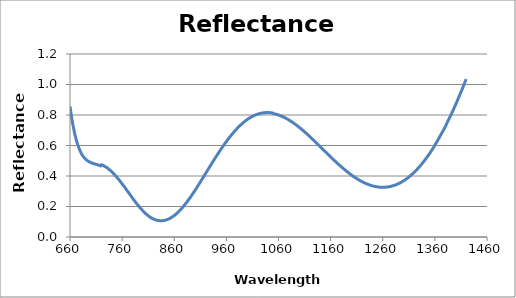
| Category | NIR Window Reflectance |
|---|---|
| 660.0 | 0.857 |
| 661.0 | 0.832 |
| 662.0 | 0.809 |
| 663.0 | 0.787 |
| 664.0 | 0.766 |
| 665.0 | 0.747 |
| 666.0 | 0.728 |
| 667.0 | 0.711 |
| 668.0 | 0.695 |
| 669.0 | 0.679 |
| 670.0 | 0.664 |
| 671.0 | 0.65 |
| 672.0 | 0.638 |
| 673.0 | 0.625 |
| 674.0 | 0.615 |
| 675.0 | 0.604 |
| 676.0 | 0.594 |
| 677.0 | 0.584 |
| 678.0 | 0.576 |
| 679.0 | 0.568 |
| 680.0 | 0.56 |
| 681.0 | 0.553 |
| 682.0 | 0.546 |
| 683.0 | 0.54 |
| 684.0 | 0.536 |
| 685.0 | 0.53 |
| 686.0 | 0.525 |
| 687.0 | 0.522 |
| 688.0 | 0.517 |
| 689.0 | 0.514 |
| 690.0 | 0.51 |
| 691.0 | 0.506 |
| 692.0 | 0.504 |
| 693.0 | 0.501 |
| 694.0 | 0.499 |
| 695.0 | 0.497 |
| 696.0 | 0.495 |
| 697.0 | 0.492 |
| 698.0 | 0.491 |
| 699.0 | 0.49 |
| 700.0 | 0.488 |
| 701.0 | 0.486 |
| 702.0 | 0.485 |
| 703.0 | 0.484 |
| 704.0 | 0.482 |
| 705.0 | 0.482 |
| 706.0 | 0.48 |
| 707.0 | 0.48 |
| 708.0 | 0.478 |
| 709.0 | 0.477 |
| 710.0 | 0.476 |
| 711.0 | 0.476 |
| 712.0 | 0.474 |
| 713.0 | 0.473 |
| 714.0 | 0.472 |
| 715.0 | 0.471 |
| 716.0 | 0.47 |
| 717.0 | 0.47 |
| 718.0 | 0.467 |
| 719.0 | 0.466 |
| 720.0 | 0.473 |
| 721.0 | 0.473 |
| 722.0 | 0.472 |
| 723.0 | 0.471 |
| 724.0 | 0.468 |
| 725.0 | 0.467 |
| 726.0 | 0.465 |
| 727.0 | 0.462 |
| 728.0 | 0.46 |
| 729.0 | 0.458 |
| 730.0 | 0.457 |
| 731.0 | 0.453 |
| 732.0 | 0.452 |
| 733.0 | 0.45 |
| 734.0 | 0.446 |
| 735.0 | 0.443 |
| 736.0 | 0.44 |
| 737.0 | 0.436 |
| 738.0 | 0.435 |
| 739.0 | 0.431 |
| 740.0 | 0.428 |
| 741.0 | 0.424 |
| 742.0 | 0.422 |
| 743.0 | 0.417 |
| 744.0 | 0.414 |
| 745.0 | 0.412 |
| 746.0 | 0.406 |
| 747.0 | 0.402 |
| 748.0 | 0.399 |
| 749.0 | 0.396 |
| 750.0 | 0.391 |
| 751.0 | 0.387 |
| 752.0 | 0.383 |
| 753.0 | 0.379 |
| 754.0 | 0.375 |
| 755.0 | 0.371 |
| 756.0 | 0.367 |
| 757.0 | 0.362 |
| 758.0 | 0.356 |
| 759.0 | 0.353 |
| 760.0 | 0.349 |
| 761.0 | 0.343 |
| 762.0 | 0.339 |
| 763.0 | 0.335 |
| 764.0 | 0.331 |
| 765.0 | 0.326 |
| 766.0 | 0.321 |
| 767.0 | 0.317 |
| 768.0 | 0.311 |
| 769.0 | 0.306 |
| 770.0 | 0.302 |
| 771.0 | 0.297 |
| 772.0 | 0.293 |
| 773.0 | 0.288 |
| 774.0 | 0.283 |
| 775.0 | 0.279 |
| 776.0 | 0.274 |
| 777.0 | 0.269 |
| 778.0 | 0.264 |
| 779.0 | 0.259 |
| 780.0 | 0.255 |
| 781.0 | 0.25 |
| 782.0 | 0.245 |
| 783.0 | 0.241 |
| 784.0 | 0.236 |
| 785.0 | 0.232 |
| 786.0 | 0.227 |
| 787.0 | 0.223 |
| 788.0 | 0.218 |
| 789.0 | 0.214 |
| 790.0 | 0.211 |
| 791.0 | 0.207 |
| 792.0 | 0.202 |
| 793.0 | 0.197 |
| 794.0 | 0.193 |
| 795.0 | 0.19 |
| 796.0 | 0.185 |
| 797.0 | 0.182 |
| 798.0 | 0.178 |
| 799.0 | 0.174 |
| 800.0 | 0.171 |
| 801.0 | 0.167 |
| 802.0 | 0.163 |
| 803.0 | 0.16 |
| 804.0 | 0.156 |
| 805.0 | 0.154 |
| 806.0 | 0.151 |
| 807.0 | 0.149 |
| 808.0 | 0.145 |
| 809.0 | 0.142 |
| 810.0 | 0.14 |
| 811.0 | 0.137 |
| 812.0 | 0.134 |
| 813.0 | 0.132 |
| 814.0 | 0.129 |
| 815.0 | 0.128 |
| 816.0 | 0.125 |
| 817.0 | 0.124 |
| 818.0 | 0.122 |
| 819.0 | 0.119 |
| 820.0 | 0.118 |
| 821.0 | 0.117 |
| 822.0 | 0.115 |
| 823.0 | 0.114 |
| 824.0 | 0.113 |
| 825.0 | 0.111 |
| 826.0 | 0.11 |
| 827.0 | 0.11 |
| 828.0 | 0.11 |
| 829.0 | 0.108 |
| 830.0 | 0.108 |
| 831.0 | 0.107 |
| 832.0 | 0.107 |
| 833.0 | 0.107 |
| 834.0 | 0.106 |
| 835.0 | 0.107 |
| 836.0 | 0.106 |
| 837.0 | 0.107 |
| 838.0 | 0.107 |
| 839.0 | 0.108 |
| 840.0 | 0.108 |
| 841.0 | 0.109 |
| 842.0 | 0.109 |
| 843.0 | 0.111 |
| 844.0 | 0.111 |
| 845.0 | 0.113 |
| 846.0 | 0.113 |
| 847.0 | 0.115 |
| 848.0 | 0.116 |
| 849.0 | 0.117 |
| 850.0 | 0.12 |
| 851.0 | 0.121 |
| 852.0 | 0.123 |
| 853.0 | 0.125 |
| 854.0 | 0.127 |
| 855.0 | 0.129 |
| 856.0 | 0.131 |
| 857.0 | 0.133 |
| 858.0 | 0.136 |
| 859.0 | 0.139 |
| 860.0 | 0.141 |
| 861.0 | 0.143 |
| 862.0 | 0.146 |
| 863.0 | 0.149 |
| 864.0 | 0.153 |
| 865.0 | 0.155 |
| 866.0 | 0.159 |
| 867.0 | 0.162 |
| 868.0 | 0.164 |
| 869.0 | 0.168 |
| 870.0 | 0.172 |
| 871.0 | 0.175 |
| 872.0 | 0.179 |
| 873.0 | 0.183 |
| 874.0 | 0.186 |
| 875.0 | 0.19 |
| 876.0 | 0.194 |
| 877.0 | 0.198 |
| 878.0 | 0.203 |
| 879.0 | 0.206 |
| 880.0 | 0.211 |
| 881.0 | 0.215 |
| 882.0 | 0.219 |
| 883.0 | 0.223 |
| 884.0 | 0.228 |
| 885.0 | 0.233 |
| 886.0 | 0.237 |
| 887.0 | 0.242 |
| 888.0 | 0.247 |
| 889.0 | 0.252 |
| 890.0 | 0.256 |
| 891.0 | 0.261 |
| 892.0 | 0.266 |
| 893.0 | 0.271 |
| 894.0 | 0.276 |
| 895.0 | 0.281 |
| 896.0 | 0.286 |
| 897.0 | 0.291 |
| 898.0 | 0.296 |
| 899.0 | 0.301 |
| 900.0 | 0.307 |
| 901.0 | 0.312 |
| 902.0 | 0.317 |
| 903.0 | 0.323 |
| 904.0 | 0.328 |
| 905.0 | 0.334 |
| 906.0 | 0.339 |
| 907.0 | 0.344 |
| 908.0 | 0.35 |
| 909.0 | 0.355 |
| 910.0 | 0.36 |
| 911.0 | 0.366 |
| 912.0 | 0.371 |
| 913.0 | 0.377 |
| 914.0 | 0.382 |
| 915.0 | 0.388 |
| 916.0 | 0.393 |
| 917.0 | 0.399 |
| 918.0 | 0.405 |
| 919.0 | 0.41 |
| 920.0 | 0.416 |
| 921.0 | 0.421 |
| 922.0 | 0.427 |
| 923.0 | 0.433 |
| 924.0 | 0.438 |
| 925.0 | 0.444 |
| 926.0 | 0.449 |
| 927.0 | 0.455 |
| 928.0 | 0.46 |
| 929.0 | 0.466 |
| 930.0 | 0.471 |
| 931.0 | 0.477 |
| 932.0 | 0.482 |
| 933.0 | 0.488 |
| 934.0 | 0.493 |
| 935.0 | 0.499 |
| 936.0 | 0.504 |
| 937.0 | 0.51 |
| 938.0 | 0.515 |
| 939.0 | 0.52 |
| 940.0 | 0.526 |
| 941.0 | 0.531 |
| 942.0 | 0.536 |
| 943.0 | 0.542 |
| 944.0 | 0.547 |
| 945.0 | 0.552 |
| 946.0 | 0.557 |
| 947.0 | 0.562 |
| 948.0 | 0.567 |
| 949.0 | 0.573 |
| 950.0 | 0.578 |
| 951.0 | 0.583 |
| 952.0 | 0.588 |
| 953.0 | 0.592 |
| 954.0 | 0.597 |
| 955.0 | 0.602 |
| 956.0 | 0.607 |
| 957.0 | 0.612 |
| 958.0 | 0.616 |
| 959.0 | 0.621 |
| 960.0 | 0.626 |
| 961.0 | 0.631 |
| 962.0 | 0.635 |
| 963.0 | 0.64 |
| 964.0 | 0.644 |
| 965.0 | 0.649 |
| 966.0 | 0.653 |
| 967.0 | 0.657 |
| 968.0 | 0.662 |
| 969.0 | 0.666 |
| 970.0 | 0.67 |
| 971.0 | 0.674 |
| 972.0 | 0.678 |
| 973.0 | 0.682 |
| 974.0 | 0.686 |
| 975.0 | 0.69 |
| 976.0 | 0.694 |
| 977.0 | 0.698 |
| 978.0 | 0.702 |
| 979.0 | 0.706 |
| 980.0 | 0.71 |
| 981.0 | 0.713 |
| 982.0 | 0.717 |
| 983.0 | 0.72 |
| 984.0 | 0.723 |
| 985.0 | 0.727 |
| 986.0 | 0.73 |
| 987.0 | 0.734 |
| 988.0 | 0.737 |
| 989.0 | 0.74 |
| 990.0 | 0.743 |
| 991.0 | 0.746 |
| 992.0 | 0.749 |
| 993.0 | 0.752 |
| 994.0 | 0.754 |
| 995.0 | 0.757 |
| 996.0 | 0.76 |
| 997.0 | 0.763 |
| 998.0 | 0.765 |
| 999.0 | 0.768 |
| 1000.0 | 0.77 |
| 1001.0 | 0.773 |
| 1002.0 | 0.775 |
| 1003.0 | 0.777 |
| 1004.0 | 0.779 |
| 1005.0 | 0.781 |
| 1006.0 | 0.783 |
| 1007.0 | 0.785 |
| 1008.0 | 0.787 |
| 1009.0 | 0.789 |
| 1010.0 | 0.791 |
| 1011.0 | 0.793 |
| 1012.0 | 0.794 |
| 1013.0 | 0.796 |
| 1014.0 | 0.798 |
| 1015.0 | 0.799 |
| 1016.0 | 0.801 |
| 1017.0 | 0.802 |
| 1018.0 | 0.803 |
| 1019.0 | 0.804 |
| 1020.0 | 0.805 |
| 1021.0 | 0.807 |
| 1022.0 | 0.807 |
| 1023.0 | 0.808 |
| 1024.0 | 0.81 |
| 1025.0 | 0.81 |
| 1026.0 | 0.811 |
| 1027.0 | 0.812 |
| 1028.0 | 0.813 |
| 1029.0 | 0.813 |
| 1030.0 | 0.814 |
| 1031.0 | 0.814 |
| 1032.0 | 0.815 |
| 1033.0 | 0.815 |
| 1034.0 | 0.815 |
| 1035.0 | 0.816 |
| 1036.0 | 0.816 |
| 1037.0 | 0.816 |
| 1038.0 | 0.816 |
| 1039.0 | 0.816 |
| 1040.0 | 0.816 |
| 1041.0 | 0.816 |
| 1042.0 | 0.816 |
| 1043.0 | 0.815 |
| 1044.0 | 0.815 |
| 1045.0 | 0.815 |
| 1046.0 | 0.814 |
| 1047.0 | 0.814 |
| 1048.0 | 0.814 |
| 1049.0 | 0.813 |
| 1050.0 | 0.809 |
| 1051.0 | 0.808 |
| 1052.0 | 0.808 |
| 1053.0 | 0.807 |
| 1054.0 | 0.806 |
| 1055.0 | 0.805 |
| 1056.0 | 0.804 |
| 1057.0 | 0.804 |
| 1058.0 | 0.803 |
| 1059.0 | 0.801 |
| 1060.0 | 0.8 |
| 1061.0 | 0.799 |
| 1062.0 | 0.798 |
| 1063.0 | 0.796 |
| 1064.0 | 0.795 |
| 1065.0 | 0.793 |
| 1066.0 | 0.792 |
| 1067.0 | 0.791 |
| 1068.0 | 0.789 |
| 1069.0 | 0.788 |
| 1070.0 | 0.786 |
| 1071.0 | 0.784 |
| 1072.0 | 0.782 |
| 1073.0 | 0.781 |
| 1074.0 | 0.779 |
| 1075.0 | 0.777 |
| 1076.0 | 0.775 |
| 1077.0 | 0.774 |
| 1078.0 | 0.771 |
| 1079.0 | 0.769 |
| 1080.0 | 0.767 |
| 1081.0 | 0.765 |
| 1082.0 | 0.763 |
| 1083.0 | 0.761 |
| 1084.0 | 0.758 |
| 1085.0 | 0.756 |
| 1086.0 | 0.754 |
| 1087.0 | 0.752 |
| 1088.0 | 0.749 |
| 1089.0 | 0.747 |
| 1090.0 | 0.744 |
| 1091.0 | 0.742 |
| 1092.0 | 0.739 |
| 1093.0 | 0.737 |
| 1094.0 | 0.734 |
| 1095.0 | 0.732 |
| 1096.0 | 0.729 |
| 1097.0 | 0.727 |
| 1098.0 | 0.724 |
| 1099.0 | 0.721 |
| 1100.0 | 0.719 |
| 1101.0 | 0.715 |
| 1102.0 | 0.713 |
| 1103.0 | 0.71 |
| 1104.0 | 0.707 |
| 1105.0 | 0.704 |
| 1106.0 | 0.701 |
| 1107.0 | 0.698 |
| 1108.0 | 0.696 |
| 1109.0 | 0.693 |
| 1110.0 | 0.689 |
| 1111.0 | 0.686 |
| 1112.0 | 0.683 |
| 1113.0 | 0.681 |
| 1114.0 | 0.677 |
| 1115.0 | 0.674 |
| 1116.0 | 0.671 |
| 1117.0 | 0.668 |
| 1118.0 | 0.665 |
| 1119.0 | 0.662 |
| 1120.0 | 0.658 |
| 1121.0 | 0.655 |
| 1122.0 | 0.653 |
| 1123.0 | 0.649 |
| 1124.0 | 0.646 |
| 1125.0 | 0.643 |
| 1126.0 | 0.638 |
| 1127.0 | 0.636 |
| 1128.0 | 0.632 |
| 1129.0 | 0.629 |
| 1130.0 | 0.626 |
| 1131.0 | 0.622 |
| 1132.0 | 0.619 |
| 1133.0 | 0.617 |
| 1134.0 | 0.613 |
| 1135.0 | 0.609 |
| 1136.0 | 0.606 |
| 1137.0 | 0.602 |
| 1138.0 | 0.599 |
| 1139.0 | 0.596 |
| 1140.0 | 0.592 |
| 1141.0 | 0.589 |
| 1142.0 | 0.586 |
| 1143.0 | 0.582 |
| 1144.0 | 0.579 |
| 1145.0 | 0.575 |
| 1146.0 | 0.572 |
| 1147.0 | 0.569 |
| 1148.0 | 0.565 |
| 1149.0 | 0.562 |
| 1150.0 | 0.559 |
| 1151.0 | 0.556 |
| 1152.0 | 0.552 |
| 1153.0 | 0.549 |
| 1154.0 | 0.545 |
| 1155.0 | 0.542 |
| 1156.0 | 0.538 |
| 1157.0 | 0.535 |
| 1158.0 | 0.532 |
| 1159.0 | 0.529 |
| 1160.0 | 0.525 |
| 1161.0 | 0.522 |
| 1162.0 | 0.519 |
| 1163.0 | 0.515 |
| 1164.0 | 0.512 |
| 1165.0 | 0.509 |
| 1166.0 | 0.505 |
| 1167.0 | 0.502 |
| 1168.0 | 0.499 |
| 1169.0 | 0.496 |
| 1170.0 | 0.493 |
| 1171.0 | 0.489 |
| 1172.0 | 0.486 |
| 1173.0 | 0.483 |
| 1174.0 | 0.48 |
| 1175.0 | 0.477 |
| 1176.0 | 0.474 |
| 1177.0 | 0.471 |
| 1178.0 | 0.468 |
| 1179.0 | 0.465 |
| 1180.0 | 0.462 |
| 1181.0 | 0.459 |
| 1182.0 | 0.456 |
| 1183.0 | 0.453 |
| 1184.0 | 0.45 |
| 1185.0 | 0.447 |
| 1186.0 | 0.444 |
| 1187.0 | 0.441 |
| 1188.0 | 0.439 |
| 1189.0 | 0.435 |
| 1190.0 | 0.433 |
| 1191.0 | 0.43 |
| 1192.0 | 0.427 |
| 1193.0 | 0.425 |
| 1194.0 | 0.422 |
| 1195.0 | 0.419 |
| 1196.0 | 0.417 |
| 1197.0 | 0.414 |
| 1198.0 | 0.412 |
| 1199.0 | 0.409 |
| 1200.0 | 0.407 |
| 1201.0 | 0.404 |
| 1202.0 | 0.402 |
| 1203.0 | 0.399 |
| 1204.0 | 0.397 |
| 1205.0 | 0.394 |
| 1206.0 | 0.392 |
| 1207.0 | 0.39 |
| 1208.0 | 0.388 |
| 1209.0 | 0.386 |
| 1210.0 | 0.383 |
| 1211.0 | 0.381 |
| 1212.0 | 0.379 |
| 1213.0 | 0.377 |
| 1214.0 | 0.375 |
| 1215.0 | 0.373 |
| 1216.0 | 0.371 |
| 1217.0 | 0.369 |
| 1218.0 | 0.367 |
| 1219.0 | 0.365 |
| 1220.0 | 0.364 |
| 1221.0 | 0.362 |
| 1222.0 | 0.36 |
| 1223.0 | 0.358 |
| 1224.0 | 0.356 |
| 1225.0 | 0.355 |
| 1226.0 | 0.353 |
| 1227.0 | 0.352 |
| 1228.0 | 0.35 |
| 1229.0 | 0.349 |
| 1230.0 | 0.348 |
| 1231.0 | 0.346 |
| 1232.0 | 0.345 |
| 1233.0 | 0.343 |
| 1234.0 | 0.342 |
| 1235.0 | 0.341 |
| 1236.0 | 0.34 |
| 1237.0 | 0.339 |
| 1238.0 | 0.338 |
| 1239.0 | 0.337 |
| 1240.0 | 0.336 |
| 1241.0 | 0.335 |
| 1242.0 | 0.334 |
| 1243.0 | 0.333 |
| 1244.0 | 0.332 |
| 1245.0 | 0.331 |
| 1246.0 | 0.331 |
| 1247.0 | 0.33 |
| 1248.0 | 0.329 |
| 1249.0 | 0.329 |
| 1250.0 | 0.329 |
| 1251.0 | 0.328 |
| 1252.0 | 0.327 |
| 1253.0 | 0.327 |
| 1254.0 | 0.327 |
| 1255.0 | 0.326 |
| 1256.0 | 0.326 |
| 1257.0 | 0.326 |
| 1258.0 | 0.326 |
| 1259.0 | 0.326 |
| 1260.0 | 0.326 |
| 1261.0 | 0.326 |
| 1262.0 | 0.326 |
| 1263.0 | 0.326 |
| 1264.0 | 0.327 |
| 1265.0 | 0.327 |
| 1266.0 | 0.327 |
| 1267.0 | 0.327 |
| 1268.0 | 0.328 |
| 1269.0 | 0.328 |
| 1270.0 | 0.328 |
| 1271.0 | 0.329 |
| 1272.0 | 0.33 |
| 1273.0 | 0.33 |
| 1274.0 | 0.331 |
| 1275.0 | 0.332 |
| 1276.0 | 0.333 |
| 1277.0 | 0.333 |
| 1278.0 | 0.335 |
| 1279.0 | 0.336 |
| 1280.0 | 0.336 |
| 1281.0 | 0.337 |
| 1282.0 | 0.338 |
| 1283.0 | 0.34 |
| 1284.0 | 0.341 |
| 1285.0 | 0.342 |
| 1286.0 | 0.344 |
| 1287.0 | 0.345 |
| 1288.0 | 0.347 |
| 1289.0 | 0.348 |
| 1290.0 | 0.35 |
| 1291.0 | 0.351 |
| 1292.0 | 0.353 |
| 1293.0 | 0.354 |
| 1294.0 | 0.356 |
| 1295.0 | 0.358 |
| 1296.0 | 0.36 |
| 1297.0 | 0.362 |
| 1298.0 | 0.364 |
| 1299.0 | 0.366 |
| 1300.0 | 0.369 |
| 1301.0 | 0.371 |
| 1302.0 | 0.373 |
| 1303.0 | 0.375 |
| 1304.0 | 0.377 |
| 1305.0 | 0.38 |
| 1306.0 | 0.383 |
| 1307.0 | 0.385 |
| 1308.0 | 0.387 |
| 1309.0 | 0.39 |
| 1310.0 | 0.393 |
| 1311.0 | 0.395 |
| 1312.0 | 0.399 |
| 1313.0 | 0.402 |
| 1314.0 | 0.405 |
| 1315.0 | 0.407 |
| 1316.0 | 0.41 |
| 1317.0 | 0.413 |
| 1318.0 | 0.416 |
| 1319.0 | 0.419 |
| 1320.0 | 0.423 |
| 1321.0 | 0.427 |
| 1322.0 | 0.43 |
| 1323.0 | 0.433 |
| 1324.0 | 0.437 |
| 1325.0 | 0.441 |
| 1326.0 | 0.444 |
| 1327.0 | 0.448 |
| 1328.0 | 0.451 |
| 1329.0 | 0.456 |
| 1330.0 | 0.459 |
| 1331.0 | 0.463 |
| 1332.0 | 0.467 |
| 1333.0 | 0.471 |
| 1334.0 | 0.475 |
| 1335.0 | 0.479 |
| 1336.0 | 0.484 |
| 1337.0 | 0.488 |
| 1338.0 | 0.492 |
| 1339.0 | 0.497 |
| 1340.0 | 0.501 |
| 1341.0 | 0.506 |
| 1342.0 | 0.51 |
| 1343.0 | 0.515 |
| 1344.0 | 0.519 |
| 1345.0 | 0.524 |
| 1346.0 | 0.529 |
| 1347.0 | 0.534 |
| 1348.0 | 0.538 |
| 1349.0 | 0.543 |
| 1350.0 | 0.548 |
| 1351.0 | 0.553 |
| 1352.0 | 0.558 |
| 1353.0 | 0.564 |
| 1354.0 | 0.568 |
| 1355.0 | 0.574 |
| 1356.0 | 0.58 |
| 1357.0 | 0.584 |
| 1358.0 | 0.59 |
| 1359.0 | 0.596 |
| 1360.0 | 0.602 |
| 1361.0 | 0.608 |
| 1362.0 | 0.613 |
| 1363.0 | 0.62 |
| 1364.0 | 0.625 |
| 1365.0 | 0.631 |
| 1366.0 | 0.638 |
| 1367.0 | 0.643 |
| 1368.0 | 0.65 |
| 1369.0 | 0.656 |
| 1370.0 | 0.662 |
| 1371.0 | 0.668 |
| 1372.0 | 0.675 |
| 1373.0 | 0.681 |
| 1374.0 | 0.687 |
| 1375.0 | 0.692 |
| 1376.0 | 0.698 |
| 1377.0 | 0.704 |
| 1378.0 | 0.71 |
| 1379.0 | 0.717 |
| 1380.0 | 0.723 |
| 1381.0 | 0.731 |
| 1382.0 | 0.738 |
| 1383.0 | 0.746 |
| 1384.0 | 0.753 |
| 1385.0 | 0.761 |
| 1386.0 | 0.767 |
| 1387.0 | 0.773 |
| 1388.0 | 0.781 |
| 1389.0 | 0.787 |
| 1390.0 | 0.794 |
| 1391.0 | 0.801 |
| 1392.0 | 0.809 |
| 1393.0 | 0.816 |
| 1394.0 | 0.823 |
| 1395.0 | 0.831 |
| 1396.0 | 0.839 |
| 1397.0 | 0.847 |
| 1398.0 | 0.855 |
| 1399.0 | 0.862 |
| 1400.0 | 0.869 |
| 1401.0 | 0.878 |
| 1402.0 | 0.885 |
| 1403.0 | 0.894 |
| 1404.0 | 0.901 |
| 1405.0 | 0.909 |
| 1406.0 | 0.917 |
| 1407.0 | 0.926 |
| 1408.0 | 0.934 |
| 1409.0 | 0.942 |
| 1410.0 | 0.95 |
| 1411.0 | 0.958 |
| 1412.0 | 0.966 |
| 1413.0 | 0.975 |
| 1414.0 | 0.983 |
| 1415.0 | 0.992 |
| 1416.0 | 1.001 |
| 1417.0 | 1.01 |
| 1418.0 | 1.018 |
| 1419.0 | 1.027 |
| 1420.0 | 1.035 |